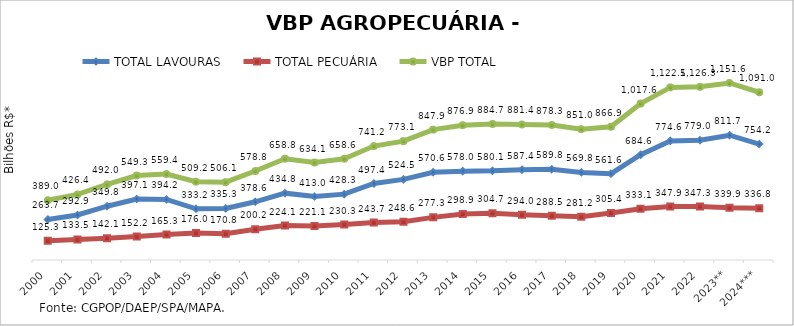
| Category | TOTAL LAVOURAS | TOTAL PECUÁRIA | VBP TOTAL |
|---|---|---|---|
| 2000 | 263.656 | 125.309 | 388.965 |
| 2001 | 292.873 | 133.524 | 426.397 |
| 2002 | 349.847 | 142.128 | 491.975 |
| 2003 | 397.074 | 152.239 | 549.313 |
| 2004 | 394.166 | 165.261 | 559.428 |
| 2005 | 333.25 | 175.972 | 509.222 |
| 2006 | 335.286 | 170.827 | 506.113 |
| 2007 | 378.644 | 200.173 | 578.817 |
| 2008 | 434.777 | 224.054 | 658.831 |
| 2009 | 412.981 | 221.077 | 634.057 |
| 2010 | 428.306 | 230.294 | 658.6 |
| 2011 | 497.425 | 243.726 | 741.151 |
| 2012 | 524.475 | 248.586 | 773.06 |
| 2013 | 570.632 | 277.313 | 847.944 |
| 2014 | 577.973 | 298.91 | 876.884 |
| 2015 | 580.07 | 304.653 | 884.724 |
| 2016 | 587.405 | 293.959 | 881.364 |
| 2017 | 589.844 | 288.452 | 878.297 |
| 2018 | 569.757 | 281.218 | 850.975 |
| 2019 | 561.563 | 305.381 | 866.944 |
| 2020 | 684.559 | 333.064 | 1017.623 |
| 2021 | 774.594 | 347.891 | 1122.485 |
| 2022 | 778.959 | 347.315 | 1126.274 |
| 2023** | 811.699 | 339.867 | 1151.566 |
| 2024*** | 754.248 | 336.792 | 1091.04 |